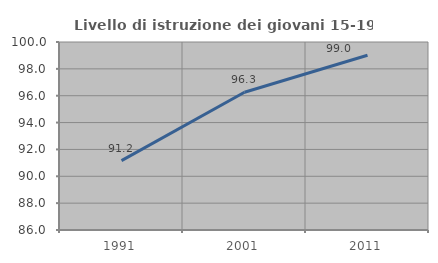
| Category | Livello di istruzione dei giovani 15-19 anni |
|---|---|
| 1991.0 | 91.163 |
| 2001.0 | 96.259 |
| 2011.0 | 99.017 |